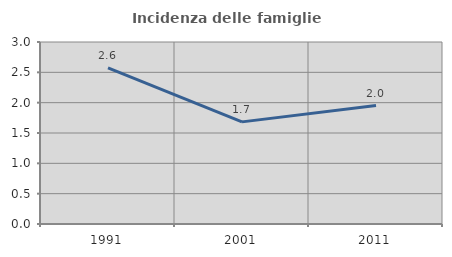
| Category | Incidenza delle famiglie numerose |
|---|---|
| 1991.0 | 2.572 |
| 2001.0 | 1.683 |
| 2011.0 | 1.953 |